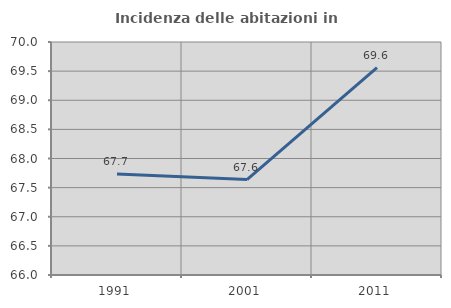
| Category | Incidenza delle abitazioni in proprietà  |
|---|---|
| 1991.0 | 67.733 |
| 2001.0 | 67.638 |
| 2011.0 | 69.559 |